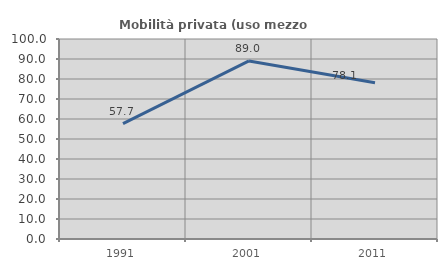
| Category | Mobilità privata (uso mezzo privato) |
|---|---|
| 1991.0 | 57.732 |
| 2001.0 | 89.041 |
| 2011.0 | 78.125 |